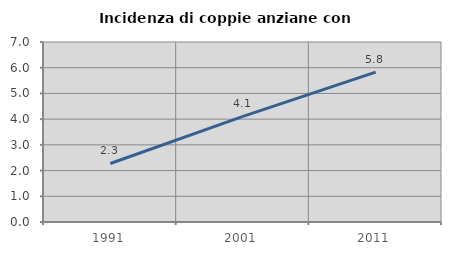
| Category | Incidenza di coppie anziane con figli |
|---|---|
| 1991.0 | 2.276 |
| 2001.0 | 4.105 |
| 2011.0 | 5.83 |